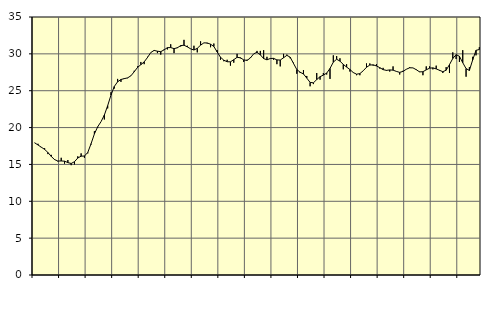
| Category | Piggar | Series 1 |
|---|---|---|
| nan | 17.9 | 17.93 |
| 87.0 | 17.8 | 17.64 |
| 87.0 | 17.3 | 17.34 |
| 87.0 | 17.2 | 17.04 |
| nan | 16.4 | 16.62 |
| 88.0 | 16.3 | 16.08 |
| 88.0 | 15.6 | 15.66 |
| 88.0 | 15.4 | 15.46 |
| nan | 15.9 | 15.47 |
| 89.0 | 15.1 | 15.44 |
| 89.0 | 15.6 | 15.25 |
| 89.0 | 14.9 | 15.13 |
| nan | 15 | 15.37 |
| 90.0 | 16.1 | 15.87 |
| 90.0 | 16.5 | 16.12 |
| 90.0 | 15.9 | 16.14 |
| nan | 16.5 | 16.62 |
| 91.0 | 17.7 | 17.81 |
| 91.0 | 19.5 | 19.14 |
| 91.0 | 20 | 20.11 |
| nan | 20.8 | 20.8 |
| 92.0 | 21.1 | 21.7 |
| 92.0 | 22.6 | 22.97 |
| 92.0 | 24.8 | 24.41 |
| nan | 25.3 | 25.58 |
| 93.0 | 26.6 | 26.21 |
| 93.0 | 26.2 | 26.52 |
| 93.0 | 26.7 | 26.64 |
| nan | 26.7 | 26.74 |
| 94.0 | 27 | 27.02 |
| 94.0 | 27.7 | 27.57 |
| 94.0 | 28.3 | 28.16 |
| nan | 28.9 | 28.53 |
| 95.0 | 28.6 | 28.91 |
| 95.0 | 29.6 | 29.51 |
| 95.0 | 30.2 | 30.18 |
| nan | 30.4 | 30.47 |
| 96.0 | 30.1 | 30.36 |
| 96.0 | 29.9 | 30.3 |
| 96.0 | 30.6 | 30.54 |
| nan | 30.6 | 30.84 |
| 97.0 | 31.3 | 30.85 |
| 97.0 | 30.1 | 30.71 |
| 97.0 | 30.9 | 30.82 |
| nan | 31 | 31.12 |
| 98.0 | 31.9 | 31.17 |
| 98.0 | 31.1 | 30.95 |
| 98.0 | 30.7 | 30.68 |
| nan | 31.1 | 30.52 |
| 99.0 | 30.2 | 30.75 |
| 99.0 | 31.7 | 31.18 |
| 99.0 | 31.5 | 31.49 |
| nan | 31.4 | 31.48 |
| 0.0 | 30.9 | 31.31 |
| 0.0 | 31.4 | 31 |
| 0.0 | 30.5 | 30.25 |
| nan | 29.2 | 29.54 |
| 1.0 | 29 | 29.14 |
| 1.0 | 29.2 | 28.93 |
| 1.0 | 28.4 | 28.92 |
| nan | 28.8 | 29.21 |
| 2.0 | 30 | 29.53 |
| 2.0 | 29.4 | 29.47 |
| 2.0 | 28.9 | 29.18 |
| nan | 29.2 | 29.11 |
| 3.0 | 29.5 | 29.44 |
| 3.0 | 30 | 30 |
| 3.0 | 30.4 | 30.22 |
| nan | 30.4 | 29.87 |
| 4.0 | 30.5 | 29.36 |
| 4.0 | 29.6 | 29.19 |
| 4.0 | 29.4 | 29.37 |
| nan | 29.2 | 29.39 |
| 5.0 | 28.6 | 29.18 |
| 5.0 | 28.3 | 29.16 |
| 5.0 | 30 | 29.47 |
| nan | 29.9 | 29.8 |
| 6.0 | 29.4 | 29.55 |
| 6.0 | 28.8 | 28.7 |
| 6.0 | 27.3 | 27.87 |
| nan | 27.4 | 27.51 |
| 7.0 | 27.8 | 27.27 |
| 7.0 | 27 | 26.71 |
| 7.0 | 25.6 | 26.13 |
| nan | 25.9 | 26.07 |
| 8.0 | 27.4 | 26.51 |
| 8.0 | 26.5 | 26.9 |
| 8.0 | 27.4 | 27.12 |
| nan | 27.2 | 27.39 |
| 9.0 | 26.6 | 28.02 |
| 9.0 | 29.8 | 28.88 |
| 9.0 | 29.7 | 29.27 |
| nan | 29.4 | 29.01 |
| 10.0 | 27.9 | 28.57 |
| 10.0 | 28.6 | 28.21 |
| 10.0 | 27.6 | 27.88 |
| nan | 27.5 | 27.47 |
| 11.0 | 27.1 | 27.24 |
| 11.0 | 27.1 | 27.32 |
| 11.0 | 27.7 | 27.7 |
| nan | 28.7 | 28.18 |
| 12.0 | 28.7 | 28.48 |
| 12.0 | 28.4 | 28.51 |
| 12.0 | 28.6 | 28.36 |
| nan | 28 | 28.13 |
| 13.0 | 28.1 | 27.86 |
| 13.0 | 27.7 | 27.76 |
| 13.0 | 27.6 | 27.82 |
| nan | 28.3 | 27.79 |
| 14.0 | 27.6 | 27.62 |
| 14.0 | 27.2 | 27.49 |
| 14.0 | 27.7 | 27.62 |
| nan | 27.9 | 27.91 |
| 15.0 | 28.2 | 28.11 |
| 15.0 | 28.1 | 28.1 |
| 15.0 | 27.9 | 27.85 |
| nan | 27.6 | 27.55 |
| 16.0 | 27.1 | 27.58 |
| 16.0 | 28.3 | 27.83 |
| 16.0 | 28.3 | 28.06 |
| nan | 27.9 | 28.1 |
| 17.0 | 28.4 | 27.96 |
| 17.0 | 27.7 | 27.77 |
| 17.0 | 27.4 | 27.58 |
| nan | 28.2 | 27.78 |
| 18.0 | 27.4 | 28.54 |
| 18.0 | 30.2 | 29.37 |
| 18.0 | 29.3 | 29.89 |
| nan | 28.9 | 29.67 |
| 19.0 | 30.5 | 28.8 |
| 19.0 | 26.9 | 28 |
| 19.0 | 28.2 | 27.75 |
| nan | 29.6 | 29.19 |
| 20.0 | 29.8 | 30.48 |
| 20.0 | 30.9 | 30.59 |